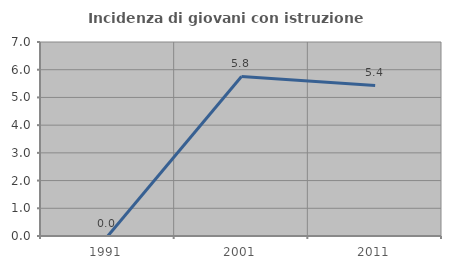
| Category | Incidenza di giovani con istruzione universitaria |
|---|---|
| 1991.0 | 0 |
| 2001.0 | 5.755 |
| 2011.0 | 5.435 |